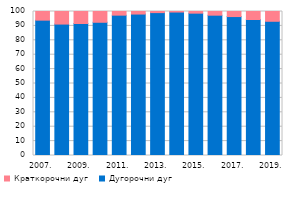
| Category | Дугорочни дуг | Краткорочни дуг |
|---|---|---|
| 2007. | 93.994 | 6.006 |
| 2008. | 91.269 | 8.731 |
| 2009. | 91.683 | 8.317 |
| 2010. | 92.524 | 7.476 |
| 2011. | 97.465 | 2.535 |
| 2012. | 98.226 | 1.774 |
| 2013. | 99.234 | 0.766 |
| 2014. | 99.616 | 0.384 |
| 2015. | 98.846 | 1.154 |
| 2016. | 97.448 | 2.552 |
| 2017. | 96.488 | 3.512 |
| 2018. | 94.424 | 5.576 |
| 2019. | 93.212 | 6.788 |